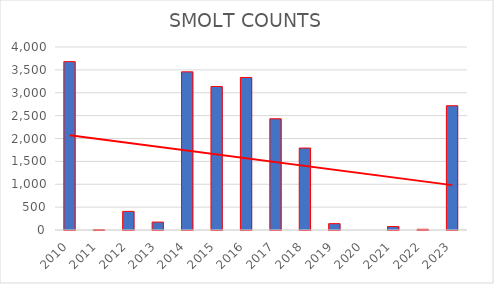
| Category | SMOLT COUNTS |
|---|---|
| 2010.0 | 3680 |
| 2011.0 | 6 |
| 2012.0 | 407 |
| 2013.0 | 173 |
| 2014.0 | 3457 |
| 2015.0 | 3137 |
| 2016.0 | 3334 |
| 2017.0 | 2431 |
| 2018.0 | 1791 |
| 2019.0 | 139 |
| 2020.0 | 0 |
| 2021.0 | 75 |
| 2022.0 | 16 |
| 2023.0 | 2716 |